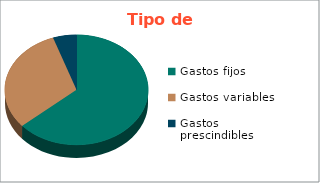
| Category | Series 0 |
|---|---|
| Gastos fijos | 30082400 |
| Gastos variables | 14662100 |
| Gastos prescindibles | 2495000 |